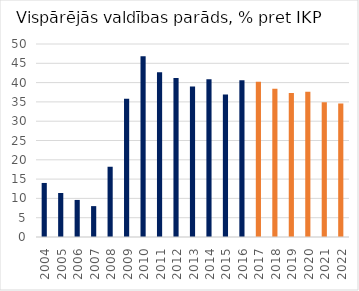
| Category | Latvia |
|---|---|
| 2004 | 14 |
| 2005 | 11.4 |
| 2006 | 9.6 |
| 2007 | 8 |
| 2008 | 18.2 |
| 2009 | 35.8 |
| 2010 | 46.8 |
| 2011 | 42.7 |
| 2012 | 41.2 |
| 2013 | 39 |
| 2014 | 40.9 |
| 2015 | 36.9 |
| 2016 | 40.6 |
| 2017 | 40.2 |
| 2018 | 38.4 |
| 2019 | 37.33 |
| 2020 | 37.605 |
| 2021 | 34.926 |
| 2022 | 34.594 |